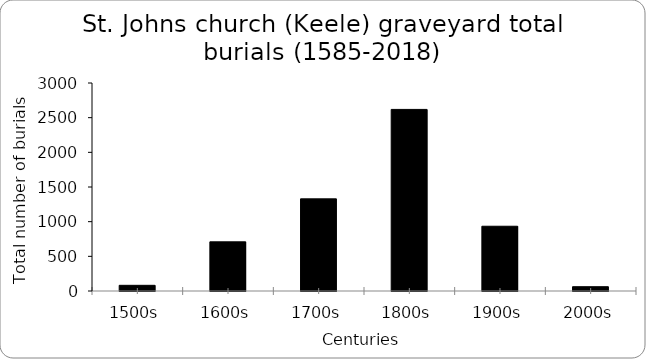
| Category | Series 0 |
|---|---|
| 1500s | 82 |
| 1600s | 709 |
| 1700s | 1329 |
| 1800s | 2619 |
| 1900s | 934 |
| 2000s | 62 |